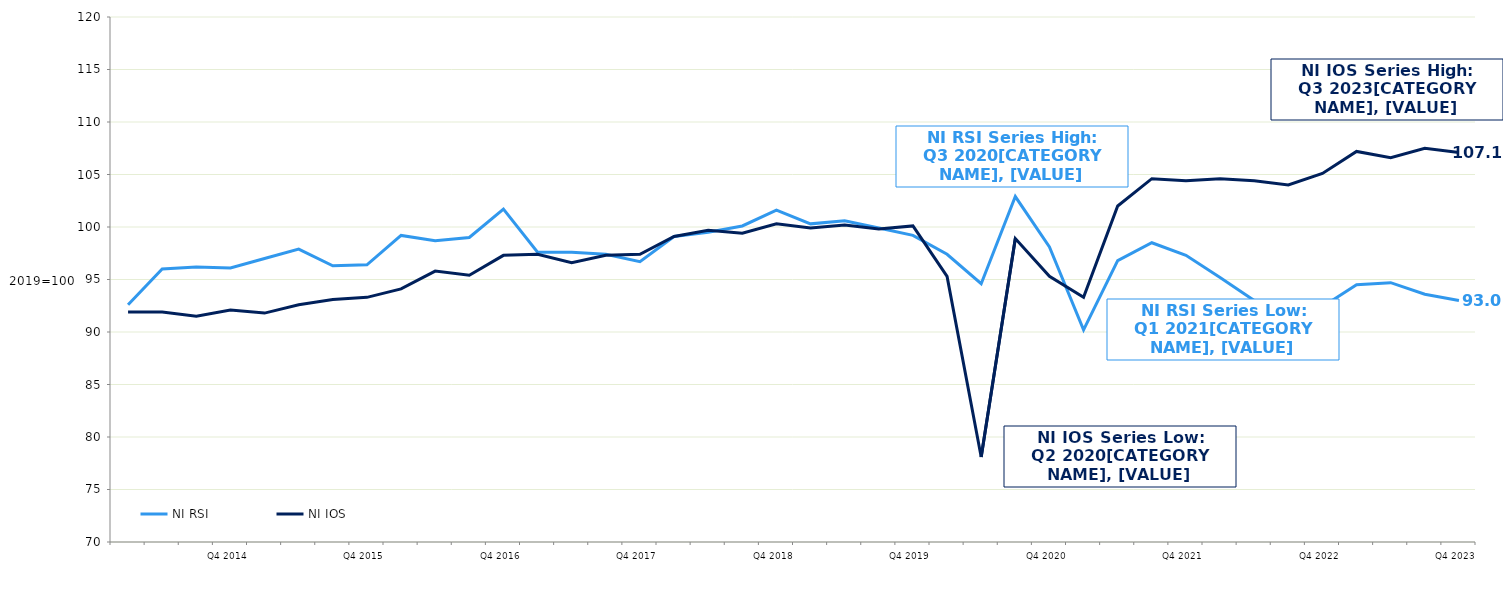
| Category | NI RSI | NI IOS |
|---|---|---|
|  | 92.6 | 91.9 |
|  | 96 | 91.9 |
|  | 96.2 | 91.5 |
| Q4 2014 | 96.1 | 92.1 |
|  | 97 | 91.8 |
|  | 97.9 | 92.6 |
|  | 96.3 | 93.1 |
| Q4 2015 | 96.4 | 93.3 |
|  | 99.2 | 94.1 |
|  | 98.7 | 95.8 |
|  | 99 | 95.4 |
| Q4 2016 | 101.7 | 97.3 |
|  | 97.6 | 97.4 |
|  | 97.6 | 96.6 |
|  | 97.4 | 97.3 |
| Q4 2017 | 96.7 | 97.4 |
|  | 99.1 | 99.1 |
|  | 99.5 | 99.7 |
|  | 100.1 | 99.4 |
| Q4 2018 | 101.6 | 100.3 |
|  | 100.3 | 99.9 |
|  | 100.6 | 100.2 |
|  | 99.9 | 99.8 |
| Q4 2019 | 99.2 | 100.1 |
|  | 97.4 | 95.3 |
|  | 94.6 | 78.1 |
|  | 102.9 | 98.9 |
| Q4 2020 | 98.1 | 95.3 |
|  | 90.2 | 93.3 |
|  | 96.8 | 102 |
|  | 98.5 | 104.6 |
| Q4 2021 | 97.3 | 104.4 |
|  | 95.2 | 104.6 |
|  | 93 | 104.4 |
|  | 90.5 | 104 |
| Q4 2022 | 92.4 | 105.1 |
|  | 94.5 | 107.2 |
|  | 94.7 | 106.6 |
|  | 93.6 | 107.5 |
| Q4 2023 | 93 | 107.1 |